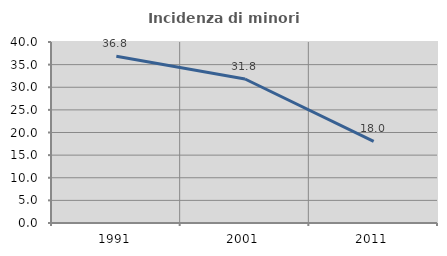
| Category | Incidenza di minori stranieri |
|---|---|
| 1991.0 | 36.842 |
| 2001.0 | 31.818 |
| 2011.0 | 18.018 |